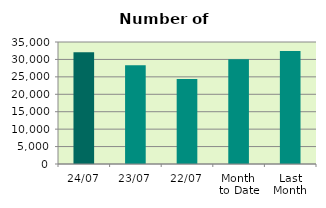
| Category | Series 0 |
|---|---|
| 24/07 | 32032 |
| 23/07 | 28304 |
| 22/07 | 24362 |
| Month 
to Date | 30054.556 |
| Last
Month | 32421.5 |